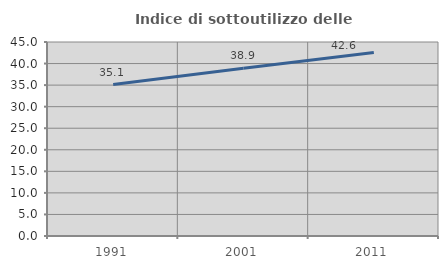
| Category | Indice di sottoutilizzo delle abitazioni  |
|---|---|
| 1991.0 | 35.14 |
| 2001.0 | 38.907 |
| 2011.0 | 42.58 |